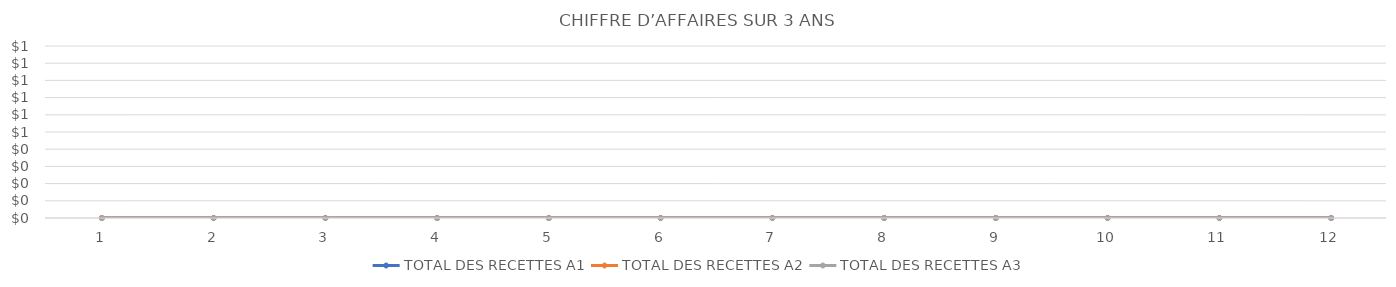
| Category | TOTAL DES RECETTES A1 | TOTAL DES RECETTES A2 | TOTAL DES RECETTES A3 |
|---|---|---|---|
| 0 | 0 | 0 | 0 |
| 1 | 0 | 0 | 0 |
| 2 | 0 | 0 | 0 |
| 3 | 0 | 0 | 0 |
| 4 | 0 | 0 | 0 |
| 5 | 0 | 0 | 0 |
| 6 | 0 | 0 | 0 |
| 7 | 0 | 0 | 0 |
| 8 | 0 | 0 | 0 |
| 9 | 0 | 0 | 0 |
| 10 | 0 | 0 | 0 |
| 11 | 0 | 0 | 0 |